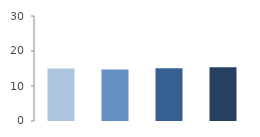
| Category | Rate (%) |
|---|---|
| 2009.0 | 14.965 |
| 2010.0 | 14.723 |
| 2011.0 | 15.05 |
| 2012.0 | 15.322 |